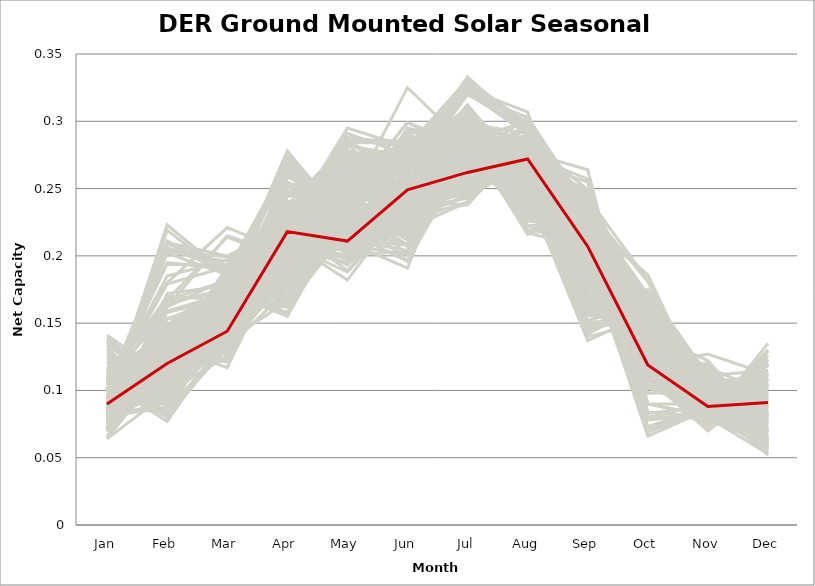
| Category | sample_001 | sample_002 | sample_003 | sample_004 | sample_005 | sample_006 | sample_007 | sample_008 | sample_009 | sample_010 | sample_011 | sample_012 | sample_013 | sample_014 | sample_015 | sample_016 | sample_017 | sample_018 | sample_019 | sample_020 | sample_021 | sample_022 | sample_023 | sample_024 | sample_025 | sample_026 | sample_027 | sample_028 | sample_029 | sample_030 | sample_031 | sample_032 | sample_033 | sample_034 | sample_035 | sample_036 | sample_037 | sample_038 | sample_039 | sample_040 | sample_041 | sample_042 | sample_043 | sample_044 | sample_045 | sample_046 | sample_047 | sample_048 | sample_049 | sample_050 | sample_051 | sample_052 | sample_053 | sample_054 | sample_055 | sample_056 | sample_057 | sample_058 | sample_059 | sample_060 | sample_061 | sample_062 | sample_063 | sample_064 | sample_065 | sample_066 | sample_067 | sample_068 | sample_069 | sample_070 | sample_071 | sample_072 | sample_073 | sample_074 | sample_075 | sample_076 | sample_077 | sample_078 | sample_079 | sample_080 | sample_081 | sample_082 | sample_083 | sample_084 | sample_085 | sample_086 | sample_087 | sample_088 | sample_089 | sample_090 | sample_091 | sample_092 | sample_093 | sample_094 | sample_095 | sample_096 | sample_097 | sample_098 | sample_099 | sample_100 | sample_101 | sample_102 | sample_103 | sample_104 | sample_105 | sample_106 | sample_107 | sample_108 | sample_109 | sample_110 | sample_111 | sample_112 | sample_113 | sample_114 | sample_115 | sample_116 | sample_117 | sample_118 | sample_119 | sample_120 | sample_121 | sample_122 | sample_123 | sample_124 | sample_125 | sample_126 | sample_127 | sample_128 | sample_129 | sample_130 | sample_131 | sample_132 | sample_133 | sample_134 | sample_135 | sample_136 | sample_137 | sample_138 | sample_139 | sample_140 | sample_141 | sample_142 | sample_143 | sample_144 | sample_145 | sample_146 | sample_147 | sample_148 | sample_149 | sample_150 | sample_151 | sample_152 | sample_153 | sample_154 | sample_155 | sample_156 | sample_157 | sample_158 | sample_159 | sample_160 | sample_161 | sample_162 | sample_163 | sample_164 | sample_165 | sample_166 | sample_167 | sample_168 | sample_169 | sample_170 | sample_171 | sample_172 | sample_173 | sample_174 | sample_175 | sample_176 | sample_178 | sample_179 | sample_180 | sample_181 | sample_182 | sample_183 | sample_184 | sample_185 | sample_186 | sample_187 | sample_188 | sample_189 | sample_190 | sample_191 | sample_192 | sample_193 | sample_194 | sample_195 | sample_196 | sample_197 | sample_198 | sample_199 | sample_200 | sample_201 | sample_202 | sample_203 | sample_204 | sample_205 | sample_206 | sample_207 | sample_208 | sample_209 | sample_210 | sample_211 | sample_212 | sample_213 | sample_214 | sample_215 | sample_216 | sample_217 | sample_218 | sample_219 | sample_220 | sample_221 | sample_222 | sample_223 | sample_224 | sample_225 | sample_226 | sample_227 | sample_228 | sample_229 | sample_230 | sample_231 | sample_232 | sample_233 | sample_234 | sample_235 | sample_236 | sample_237 | sample_238 | sample_239 | sample_240 | sample_241 | sample_242 | sample_243 | sample_244 | sample_245 | sample_246 | sample_247 | sample_248 | sample_249 | sample_250 | sample_177 |
|---|---|---|---|---|---|---|---|---|---|---|---|---|---|---|---|---|---|---|---|---|---|---|---|---|---|---|---|---|---|---|---|---|---|---|---|---|---|---|---|---|---|---|---|---|---|---|---|---|---|---|---|---|---|---|---|---|---|---|---|---|---|---|---|---|---|---|---|---|---|---|---|---|---|---|---|---|---|---|---|---|---|---|---|---|---|---|---|---|---|---|---|---|---|---|---|---|---|---|---|---|---|---|---|---|---|---|---|---|---|---|---|---|---|---|---|---|---|---|---|---|---|---|---|---|---|---|---|---|---|---|---|---|---|---|---|---|---|---|---|---|---|---|---|---|---|---|---|---|---|---|---|---|---|---|---|---|---|---|---|---|---|---|---|---|---|---|---|---|---|---|---|---|---|---|---|---|---|---|---|---|---|---|---|---|---|---|---|---|---|---|---|---|---|---|---|---|---|---|---|---|---|---|---|---|---|---|---|---|---|---|---|---|---|---|---|---|---|---|---|---|---|---|---|---|---|---|---|---|---|---|---|---|---|---|---|---|---|---|---|---|---|---|---|---|---|---|---|---|---|---|
| Jan | 0.111 | 0.075 | 0.078 | 0.105 | 0.111 | 0.086 | 0.087 | 0.134 | 0.117 | 0.109 | 0.077 | 0.083 | 0.102 | 0.08 | 0.125 | 0.086 | 0.108 | 0.113 | 0.124 | 0.076 | 0.087 | 0.087 | 0.089 | 0.106 | 0.108 | 0.099 | 0.093 | 0.118 | 0.09 | 0.075 | 0.087 | 0.083 | 0.1 | 0.087 | 0.079 | 0.082 | 0.08 | 0.09 | 0.1 | 0.141 | 0.093 | 0.122 | 0.11 | 0.081 | 0.07 | 0.093 | 0.128 | 0.139 | 0.112 | 0.093 | 0.089 | 0.086 | 0.094 | 0.116 | 0.101 | 0.137 | 0.131 | 0.077 | 0.116 | 0.077 | 0.107 | 0.1 | 0.08 | 0.07 | 0.094 | 0.08 | 0.107 | 0.089 | 0.099 | 0.117 | 0.09 | 0.087 | 0.098 | 0.11 | 0.089 | 0.072 | 0.113 | 0.112 | 0.117 | 0.086 | 0.118 | 0.112 | 0.101 | 0.136 | 0.096 | 0.122 | 0.115 | 0.107 | 0.088 | 0.09 | 0.094 | 0.085 | 0.086 | 0.086 | 0.117 | 0.072 | 0.122 | 0.113 | 0.119 | 0.082 | 0.112 | 0.066 | 0.073 | 0.083 | 0.098 | 0.093 | 0.094 | 0.081 | 0.095 | 0.134 | 0.1 | 0.121 | 0.133 | 0.137 | 0.107 | 0.093 | 0.077 | 0.094 | 0.086 | 0.08 | 0.071 | 0.086 | 0.083 | 0.07 | 0.083 | 0.085 | 0.112 | 0.085 | 0.09 | 0.088 | 0.129 | 0.108 | 0.07 | 0.11 | 0.098 | 0.064 | 0.085 | 0.081 | 0.089 | 0.093 | 0.079 | 0.104 | 0.096 | 0.131 | 0.098 | 0.09 | 0.1 | 0.088 | 0.072 | 0.102 | 0.091 | 0.081 | 0.075 | 0.1 | 0.116 | 0.064 | 0.122 | 0.122 | 0.096 | 0.081 | 0.101 | 0.138 | 0.102 | 0.112 | 0.099 | 0.09 | 0.097 | 0.087 | 0.09 | 0.117 | 0.109 | 0.082 | 0.083 | 0.087 | 0.087 | 0.113 | 0.077 | 0.086 | 0.088 | 0.087 | 0.096 | 0.078 | 0.08 | 0.102 | 0.092 | 0.09 | 0.113 | 0.095 | 0.103 | 0.114 | 0.106 | 0.072 | 0.087 | 0.1 | 0.085 | 0.092 | 0.081 | 0.106 | 0.1 | 0.095 | 0.105 | 0.098 | 0.086 | 0.088 | 0.115 | 0.085 | 0.101 | 0.111 | 0.122 | 0.108 | 0.082 | 0.108 | 0.091 | 0.093 | 0.109 | 0.089 | 0.107 | 0.099 | 0.106 | 0.079 | 0.112 | 0.101 | 0.099 | 0.108 | 0.115 | 0.081 | 0.092 | 0.11 | 0.11 | 0.065 | 0.116 | 0.11 | 0.07 | 0.09 | 0.111 | 0.097 | 0.114 | 0.094 | 0.127 | 0.137 | 0.079 | 0.086 | 0.085 | 0.115 | 0.101 | 0.117 | 0.094 | 0.08 | 0.072 | 0.09 |
| Feb | 0.124 | 0.118 | 0.164 | 0.118 | 0.122 | 0.108 | 0.125 | 0.105 | 0.088 | 0.106 | 0.135 | 0.118 | 0.115 | 0.167 | 0.106 | 0.14 | 0.08 | 0.135 | 0.109 | 0.145 | 0.108 | 0.122 | 0.148 | 0.133 | 0.13 | 0.179 | 0.112 | 0.108 | 0.144 | 0.145 | 0.109 | 0.098 | 0.124 | 0.128 | 0.118 | 0.12 | 0.134 | 0.138 | 0.167 | 0.11 | 0.126 | 0.109 | 0.116 | 0.211 | 0.159 | 0.12 | 0.101 | 0.099 | 0.134 | 0.11 | 0.124 | 0.113 | 0.093 | 0.112 | 0.195 | 0.098 | 0.093 | 0.141 | 0.101 | 0.094 | 0.158 | 0.205 | 0.133 | 0.149 | 0.086 | 0.13 | 0.089 | 0.209 | 0.21 | 0.118 | 0.125 | 0.102 | 0.122 | 0.141 | 0.11 | 0.145 | 0.131 | 0.109 | 0.09 | 0.107 | 0.119 | 0.112 | 0.12 | 0.097 | 0.09 | 0.102 | 0.119 | 0.112 | 0.108 | 0.11 | 0.109 | 0.127 | 0.133 | 0.133 | 0.111 | 0.139 | 0.113 | 0.132 | 0.126 | 0.118 | 0.096 | 0.122 | 0.153 | 0.106 | 0.112 | 0.113 | 0.129 | 0.12 | 0.14 | 0.101 | 0.094 | 0.109 | 0.109 | 0.098 | 0.123 | 0.104 | 0.102 | 0.119 | 0.104 | 0.129 | 0.149 | 0.128 | 0.219 | 0.115 | 0.131 | 0.138 | 0.128 | 0.121 | 0.131 | 0.111 | 0.104 | 0.128 | 0.113 | 0.128 | 0.12 | 0.098 | 0.126 | 0.087 | 0.112 | 0.125 | 0.121 | 0.162 | 0.126 | 0.092 | 0.119 | 0.121 | 0.126 | 0.115 | 0.172 | 0.114 | 0.145 | 0.132 | 0.167 | 0.185 | 0.122 | 0.121 | 0.12 | 0.118 | 0.125 | 0.134 | 0.203 | 0.116 | 0.12 | 0.137 | 0.096 | 0.145 | 0.097 | 0.146 | 0.124 | 0.113 | 0.138 | 0.111 | 0.104 | 0.096 | 0.103 | 0.143 | 0.149 | 0.11 | 0.117 | 0.133 | 0.104 | 0.117 | 0.121 | 0.124 | 0.117 | 0.099 | 0.124 | 0.13 | 0.083 | 0.084 | 0.077 | 0.139 | 0.084 | 0.194 | 0.137 | 0.206 | 0.136 | 0.108 | 0.112 | 0.1 | 0.17 | 0.093 | 0.111 | 0.223 | 0.123 | 0.115 | 0.135 | 0.125 | 0.097 | 0.124 | 0.123 | 0.088 | 0.111 | 0.123 | 0.18 | 0.098 | 0.158 | 0.124 | 0.084 | 0.162 | 0.143 | 0.21 | 0.133 | 0.143 | 0.119 | 0.126 | 0.115 | 0.119 | 0.089 | 0.128 | 0.114 | 0.126 | 0.154 | 0.111 | 0.082 | 0.117 | 0.121 | 0.102 | 0.108 | 0.098 | 0.125 | 0.202 | 0.108 | 0.134 | 0.123 | 0.118 | 0.119 | 0.118 | 0.144 | 0.12 |
| Mar | 0.153 | 0.189 | 0.176 | 0.16 | 0.172 | 0.147 | 0.173 | 0.131 | 0.159 | 0.143 | 0.173 | 0.174 | 0.158 | 0.182 | 0.137 | 0.178 | 0.134 | 0.168 | 0.135 | 0.166 | 0.169 | 0.174 | 0.17 | 0.117 | 0.121 | 0.192 | 0.15 | 0.156 | 0.165 | 0.179 | 0.15 | 0.156 | 0.192 | 0.157 | 0.188 | 0.175 | 0.174 | 0.163 | 0.214 | 0.155 | 0.145 | 0.153 | 0.152 | 0.186 | 0.172 | 0.17 | 0.135 | 0.147 | 0.148 | 0.174 | 0.178 | 0.174 | 0.155 | 0.172 | 0.19 | 0.148 | 0.151 | 0.161 | 0.153 | 0.141 | 0.17 | 0.199 | 0.174 | 0.15 | 0.185 | 0.151 | 0.153 | 0.189 | 0.2 | 0.174 | 0.153 | 0.181 | 0.145 | 0.151 | 0.166 | 0.172 | 0.147 | 0.147 | 0.164 | 0.147 | 0.122 | 0.16 | 0.169 | 0.135 | 0.151 | 0.154 | 0.141 | 0.166 | 0.156 | 0.146 | 0.139 | 0.178 | 0.173 | 0.175 | 0.166 | 0.153 | 0.133 | 0.147 | 0.167 | 0.172 | 0.151 | 0.133 | 0.171 | 0.144 | 0.153 | 0.153 | 0.162 | 0.185 | 0.182 | 0.15 | 0.172 | 0.134 | 0.149 | 0.14 | 0.162 | 0.161 | 0.14 | 0.145 | 0.142 | 0.152 | 0.177 | 0.173 | 0.185 | 0.189 | 0.175 | 0.176 | 0.154 | 0.17 | 0.154 | 0.162 | 0.139 | 0.142 | 0.131 | 0.127 | 0.149 | 0.126 | 0.174 | 0.131 | 0.153 | 0.168 | 0.183 | 0.215 | 0.143 | 0.138 | 0.159 | 0.164 | 0.146 | 0.159 | 0.178 | 0.173 | 0.171 | 0.171 | 0.173 | 0.197 | 0.128 | 0.134 | 0.177 | 0.153 | 0.144 | 0.142 | 0.196 | 0.155 | 0.156 | 0.17 | 0.153 | 0.167 | 0.154 | 0.171 | 0.165 | 0.138 | 0.148 | 0.171 | 0.167 | 0.15 | 0.159 | 0.15 | 0.171 | 0.169 | 0.169 | 0.173 | 0.157 | 0.182 | 0.153 | 0.172 | 0.147 | 0.157 | 0.163 | 0.146 | 0.155 | 0.131 | 0.141 | 0.162 | 0.137 | 0.193 | 0.175 | 0.189 | 0.177 | 0.173 | 0.163 | 0.15 | 0.167 | 0.147 | 0.144 | 0.186 | 0.155 | 0.157 | 0.164 | 0.123 | 0.158 | 0.161 | 0.185 | 0.155 | 0.168 | 0.142 | 0.221 | 0.151 | 0.168 | 0.178 | 0.169 | 0.183 | 0.168 | 0.193 | 0.14 | 0.17 | 0.157 | 0.151 | 0.142 | 0.177 | 0.159 | 0.136 | 0.15 | 0.147 | 0.15 | 0.148 | 0.135 | 0.147 | 0.169 | 0.151 | 0.143 | 0.138 | 0.159 | 0.186 | 0.139 | 0.153 | 0.165 | 0.134 | 0.146 | 0.183 | 0.177 | 0.144 |
| Apr | 0.238 | 0.269 | 0.237 | 0.234 | 0.216 | 0.224 | 0.162 | 0.21 | 0.187 | 0.178 | 0.225 | 0.175 | 0.233 | 0.248 | 0.212 | 0.185 | 0.187 | 0.222 | 0.206 | 0.215 | 0.255 | 0.162 | 0.188 | 0.209 | 0.208 | 0.219 | 0.192 | 0.203 | 0.185 | 0.227 | 0.253 | 0.214 | 0.202 | 0.213 | 0.263 | 0.182 | 0.179 | 0.185 | 0.197 | 0.205 | 0.19 | 0.218 | 0.238 | 0.226 | 0.245 | 0.164 | 0.209 | 0.207 | 0.186 | 0.278 | 0.165 | 0.167 | 0.217 | 0.203 | 0.225 | 0.215 | 0.212 | 0.218 | 0.211 | 0.21 | 0.232 | 0.222 | 0.17 | 0.201 | 0.201 | 0.196 | 0.174 | 0.23 | 0.222 | 0.203 | 0.22 | 0.228 | 0.188 | 0.182 | 0.276 | 0.234 | 0.178 | 0.223 | 0.198 | 0.244 | 0.211 | 0.203 | 0.228 | 0.211 | 0.217 | 0.205 | 0.179 | 0.227 | 0.213 | 0.22 | 0.193 | 0.178 | 0.184 | 0.174 | 0.214 | 0.209 | 0.197 | 0.186 | 0.223 | 0.273 | 0.175 | 0.183 | 0.226 | 0.217 | 0.188 | 0.187 | 0.163 | 0.268 | 0.202 | 0.213 | 0.186 | 0.203 | 0.21 | 0.208 | 0.225 | 0.259 | 0.212 | 0.181 | 0.224 | 0.201 | 0.224 | 0.267 | 0.224 | 0.263 | 0.183 | 0.181 | 0.221 | 0.276 | 0.216 | 0.217 | 0.208 | 0.188 | 0.191 | 0.213 | 0.192 | 0.201 | 0.167 | 0.175 | 0.229 | 0.217 | 0.261 | 0.2 | 0.194 | 0.204 | 0.234 | 0.199 | 0.208 | 0.201 | 0.251 | 0.158 | 0.186 | 0.171 | 0.254 | 0.214 | 0.204 | 0.188 | 0.246 | 0.214 | 0.207 | 0.231 | 0.215 | 0.197 | 0.234 | 0.205 | 0.222 | 0.184 | 0.225 | 0.177 | 0.181 | 0.198 | 0.185 | 0.272 | 0.26 | 0.223 | 0.231 | 0.193 | 0.24 | 0.27 | 0.271 | 0.168 | 0.264 | 0.266 | 0.202 | 0.238 | 0.191 | 0.22 | 0.219 | 0.197 | 0.22 | 0.185 | 0.191 | 0.22 | 0.166 | 0.228 | 0.17 | 0.223 | 0.186 | 0.155 | 0.224 | 0.259 | 0.233 | 0.222 | 0.22 | 0.23 | 0.218 | 0.206 | 0.225 | 0.208 | 0.189 | 0.232 | 0.267 | 0.189 | 0.252 | 0.198 | 0.203 | 0.206 | 0.229 | 0.157 | 0.19 | 0.247 | 0.211 | 0.222 | 0.19 | 0.209 | 0.211 | 0.197 | 0.22 | 0.211 | 0.193 | 0.183 | 0.182 | 0.178 | 0.212 | 0.184 | 0.189 | 0.193 | 0.209 | 0.254 | 0.215 | 0.212 | 0.205 | 0.227 | 0.224 | 0.192 | 0.162 | 0.202 | 0.197 | 0.265 | 0.225 | 0.218 |
| May | 0.226 | 0.234 | 0.243 | 0.282 | 0.193 | 0.221 | 0.22 | 0.275 | 0.21 | 0.238 | 0.261 | 0.217 | 0.276 | 0.24 | 0.27 | 0.219 | 0.248 | 0.295 | 0.261 | 0.252 | 0.229 | 0.227 | 0.222 | 0.257 | 0.251 | 0.214 | 0.231 | 0.201 | 0.221 | 0.255 | 0.255 | 0.262 | 0.245 | 0.262 | 0.236 | 0.222 | 0.225 | 0.228 | 0.2 | 0.276 | 0.228 | 0.207 | 0.283 | 0.218 | 0.248 | 0.229 | 0.264 | 0.285 | 0.236 | 0.224 | 0.225 | 0.229 | 0.259 | 0.201 | 0.202 | 0.278 | 0.283 | 0.27 | 0.212 | 0.254 | 0.261 | 0.208 | 0.224 | 0.278 | 0.225 | 0.251 | 0.224 | 0.21 | 0.213 | 0.199 | 0.273 | 0.207 | 0.228 | 0.249 | 0.224 | 0.258 | 0.233 | 0.205 | 0.218 | 0.253 | 0.252 | 0.218 | 0.278 | 0.275 | 0.26 | 0.212 | 0.235 | 0.291 | 0.257 | 0.26 | 0.222 | 0.219 | 0.222 | 0.222 | 0.197 | 0.27 | 0.26 | 0.26 | 0.189 | 0.222 | 0.233 | 0.239 | 0.253 | 0.264 | 0.222 | 0.221 | 0.237 | 0.24 | 0.249 | 0.279 | 0.232 | 0.271 | 0.273 | 0.286 | 0.287 | 0.236 | 0.25 | 0.225 | 0.263 | 0.251 | 0.256 | 0.232 | 0.207 | 0.236 | 0.226 | 0.22 | 0.207 | 0.227 | 0.273 | 0.269 | 0.262 | 0.24 | 0.238 | 0.253 | 0.229 | 0.229 | 0.222 | 0.234 | 0.254 | 0.271 | 0.237 | 0.2 | 0.225 | 0.271 | 0.27 | 0.256 | 0.224 | 0.261 | 0.235 | 0.238 | 0.226 | 0.215 | 0.242 | 0.216 | 0.258 | 0.241 | 0.239 | 0.209 | 0.223 | 0.228 | 0.211 | 0.278 | 0.267 | 0.195 | 0.267 | 0.227 | 0.263 | 0.229 | 0.232 | 0.261 | 0.248 | 0.227 | 0.234 | 0.261 | 0.24 | 0.259 | 0.244 | 0.228 | 0.225 | 0.228 | 0.235 | 0.239 | 0.257 | 0.251 | 0.216 | 0.264 | 0.288 | 0.226 | 0.251 | 0.25 | 0.24 | 0.26 | 0.229 | 0.21 | 0.22 | 0.208 | 0.218 | 0.235 | 0.239 | 0.236 | 0.254 | 0.263 | 0.224 | 0.204 | 0.203 | 0.258 | 0.284 | 0.255 | 0.208 | 0.286 | 0.232 | 0.24 | 0.23 | 0.222 | 0.208 | 0.258 | 0.258 | 0.234 | 0.234 | 0.236 | 0.182 | 0.209 | 0.222 | 0.188 | 0.204 | 0.247 | 0.213 | 0.2 | 0.232 | 0.239 | 0.24 | 0.236 | 0.274 | 0.217 | 0.241 | 0.227 | 0.194 | 0.241 | 0.276 | 0.276 | 0.256 | 0.209 | 0.261 | 0.266 | 0.235 | 0.259 | 0.218 | 0.237 | 0.255 | 0.211 |
| Jun | 0.255 | 0.275 | 0.288 | 0.274 | 0.235 | 0.238 | 0.23 | 0.253 | 0.191 | 0.269 | 0.261 | 0.223 | 0.278 | 0.287 | 0.241 | 0.233 | 0.233 | 0.281 | 0.25 | 0.27 | 0.281 | 0.22 | 0.248 | 0.252 | 0.256 | 0.223 | 0.244 | 0.203 | 0.241 | 0.282 | 0.253 | 0.217 | 0.253 | 0.28 | 0.272 | 0.226 | 0.238 | 0.243 | 0.236 | 0.273 | 0.24 | 0.22 | 0.271 | 0.249 | 0.29 | 0.226 | 0.245 | 0.256 | 0.281 | 0.284 | 0.215 | 0.23 | 0.23 | 0.23 | 0.229 | 0.258 | 0.242 | 0.239 | 0.208 | 0.217 | 0.263 | 0.242 | 0.243 | 0.225 | 0.248 | 0.279 | 0.258 | 0.25 | 0.234 | 0.232 | 0.28 | 0.265 | 0.24 | 0.269 | 0.283 | 0.277 | 0.271 | 0.22 | 0.196 | 0.253 | 0.258 | 0.209 | 0.268 | 0.25 | 0.229 | 0.204 | 0.273 | 0.275 | 0.267 | 0.224 | 0.228 | 0.225 | 0.23 | 0.24 | 0.235 | 0.23 | 0.254 | 0.273 | 0.238 | 0.288 | 0.269 | 0.276 | 0.285 | 0.214 | 0.226 | 0.24 | 0.208 | 0.276 | 0.246 | 0.24 | 0.224 | 0.252 | 0.261 | 0.257 | 0.285 | 0.282 | 0.224 | 0.24 | 0.218 | 0.279 | 0.286 | 0.282 | 0.241 | 0.277 | 0.237 | 0.236 | 0.233 | 0.295 | 0.28 | 0.267 | 0.24 | 0.278 | 0.271 | 0.248 | 0.245 | 0.278 | 0.229 | 0.286 | 0.257 | 0.252 | 0.274 | 0.23 | 0.233 | 0.235 | 0.279 | 0.272 | 0.234 | 0.274 | 0.283 | 0.201 | 0.237 | 0.229 | 0.299 | 0.225 | 0.251 | 0.276 | 0.325 | 0.225 | 0.24 | 0.257 | 0.235 | 0.268 | 0.278 | 0.241 | 0.228 | 0.247 | 0.223 | 0.237 | 0.227 | 0.244 | 0.278 | 0.291 | 0.276 | 0.222 | 0.258 | 0.278 | 0.299 | 0.275 | 0.293 | 0.245 | 0.267 | 0.276 | 0.278 | 0.265 | 0.232 | 0.223 | 0.281 | 0.243 | 0.242 | 0.24 | 0.234 | 0.26 | 0.271 | 0.233 | 0.24 | 0.246 | 0.237 | 0.196 | 0.28 | 0.275 | 0.251 | 0.221 | 0.247 | 0.263 | 0.223 | 0.273 | 0.284 | 0.236 | 0.201 | 0.282 | 0.282 | 0.229 | 0.283 | 0.233 | 0.23 | 0.218 | 0.252 | 0.207 | 0.233 | 0.279 | 0.241 | 0.233 | 0.232 | 0.236 | 0.241 | 0.28 | 0.249 | 0.242 | 0.229 | 0.266 | 0.272 | 0.272 | 0.244 | 0.234 | 0.223 | 0.23 | 0.227 | 0.261 | 0.253 | 0.248 | 0.28 | 0.244 | 0.22 | 0.275 | 0.212 | 0.265 | 0.22 | 0.266 | 0.271 | 0.249 |
| Jul | 0.272 | 0.281 | 0.279 | 0.286 | 0.28 | 0.249 | 0.285 | 0.285 | 0.3 | 0.322 | 0.283 | 0.276 | 0.298 | 0.291 | 0.271 | 0.3 | 0.288 | 0.288 | 0.283 | 0.291 | 0.289 | 0.287 | 0.301 | 0.274 | 0.276 | 0.273 | 0.244 | 0.285 | 0.292 | 0.279 | 0.289 | 0.27 | 0.273 | 0.309 | 0.29 | 0.277 | 0.295 | 0.297 | 0.261 | 0.275 | 0.246 | 0.285 | 0.29 | 0.311 | 0.274 | 0.292 | 0.277 | 0.284 | 0.331 | 0.292 | 0.283 | 0.286 | 0.277 | 0.271 | 0.301 | 0.274 | 0.276 | 0.29 | 0.292 | 0.257 | 0.27 | 0.297 | 0.282 | 0.298 | 0.286 | 0.3 | 0.32 | 0.312 | 0.299 | 0.275 | 0.303 | 0.29 | 0.254 | 0.32 | 0.283 | 0.281 | 0.333 | 0.27 | 0.298 | 0.286 | 0.269 | 0.294 | 0.279 | 0.279 | 0.278 | 0.293 | 0.324 | 0.286 | 0.3 | 0.273 | 0.244 | 0.282 | 0.291 | 0.294 | 0.268 | 0.292 | 0.28 | 0.324 | 0.289 | 0.289 | 0.322 | 0.293 | 0.289 | 0.264 | 0.24 | 0.238 | 0.282 | 0.289 | 0.283 | 0.272 | 0.307 | 0.278 | 0.275 | 0.285 | 0.289 | 0.289 | 0.257 | 0.245 | 0.27 | 0.307 | 0.284 | 0.294 | 0.308 | 0.287 | 0.281 | 0.303 | 0.281 | 0.284 | 0.306 | 0.299 | 0.273 | 0.33 | 0.282 | 0.282 | 0.245 | 0.286 | 0.283 | 0.278 | 0.28 | 0.296 | 0.293 | 0.262 | 0.248 | 0.274 | 0.297 | 0.271 | 0.254 | 0.302 | 0.281 | 0.273 | 0.302 | 0.288 | 0.277 | 0.27 | 0.272 | 0.285 | 0.282 | 0.284 | 0.254 | 0.245 | 0.299 | 0.266 | 0.298 | 0.283 | 0.289 | 0.301 | 0.279 | 0.306 | 0.301 | 0.272 | 0.327 | 0.294 | 0.285 | 0.273 | 0.27 | 0.323 | 0.282 | 0.28 | 0.29 | 0.29 | 0.285 | 0.288 | 0.296 | 0.29 | 0.248 | 0.279 | 0.288 | 0.251 | 0.279 | 0.278 | 0.29 | 0.3 | 0.283 | 0.305 | 0.293 | 0.302 | 0.3 | 0.274 | 0.289 | 0.296 | 0.263 | 0.28 | 0.255 | 0.312 | 0.28 | 0.305 | 0.292 | 0.266 | 0.298 | 0.298 | 0.297 | 0.309 | 0.289 | 0.252 | 0.259 | 0.276 | 0.271 | 0.286 | 0.303 | 0.293 | 0.295 | 0.296 | 0.255 | 0.286 | 0.279 | 0.297 | 0.25 | 0.281 | 0.305 | 0.277 | 0.322 | 0.329 | 0.303 | 0.243 | 0.285 | 0.238 | 0.279 | 0.292 | 0.285 | 0.286 | 0.303 | 0.31 | 0.273 | 0.324 | 0.273 | 0.278 | 0.24 | 0.286 | 0.278 | 0.262 |
| Aug | 0.273 | 0.242 | 0.284 | 0.219 | 0.232 | 0.27 | 0.253 | 0.258 | 0.247 | 0.292 | 0.28 | 0.253 | 0.227 | 0.279 | 0.259 | 0.247 | 0.27 | 0.216 | 0.26 | 0.283 | 0.252 | 0.262 | 0.242 | 0.254 | 0.258 | 0.297 | 0.284 | 0.236 | 0.24 | 0.284 | 0.268 | 0.269 | 0.252 | 0.25 | 0.245 | 0.256 | 0.254 | 0.24 | 0.299 | 0.242 | 0.288 | 0.24 | 0.217 | 0.261 | 0.286 | 0.258 | 0.257 | 0.246 | 0.298 | 0.24 | 0.263 | 0.26 | 0.273 | 0.234 | 0.269 | 0.241 | 0.245 | 0.282 | 0.246 | 0.275 | 0.267 | 0.277 | 0.25 | 0.291 | 0.272 | 0.256 | 0.303 | 0.26 | 0.275 | 0.239 | 0.241 | 0.254 | 0.287 | 0.294 | 0.244 | 0.279 | 0.293 | 0.236 | 0.249 | 0.273 | 0.252 | 0.25 | 0.223 | 0.256 | 0.277 | 0.239 | 0.291 | 0.218 | 0.248 | 0.275 | 0.269 | 0.254 | 0.251 | 0.251 | 0.235 | 0.283 | 0.254 | 0.297 | 0.23 | 0.246 | 0.299 | 0.283 | 0.283 | 0.274 | 0.283 | 0.287 | 0.275 | 0.236 | 0.257 | 0.239 | 0.249 | 0.264 | 0.241 | 0.254 | 0.226 | 0.258 | 0.277 | 0.287 | 0.269 | 0.256 | 0.283 | 0.244 | 0.254 | 0.247 | 0.249 | 0.25 | 0.241 | 0.256 | 0.242 | 0.242 | 0.257 | 0.292 | 0.27 | 0.253 | 0.287 | 0.3 | 0.257 | 0.287 | 0.279 | 0.232 | 0.239 | 0.297 | 0.284 | 0.253 | 0.233 | 0.303 | 0.269 | 0.251 | 0.274 | 0.271 | 0.248 | 0.259 | 0.281 | 0.297 | 0.253 | 0.284 | 0.288 | 0.237 | 0.276 | 0.28 | 0.282 | 0.239 | 0.229 | 0.235 | 0.277 | 0.24 | 0.28 | 0.247 | 0.247 | 0.256 | 0.299 | 0.247 | 0.252 | 0.271 | 0.283 | 0.298 | 0.283 | 0.248 | 0.252 | 0.254 | 0.251 | 0.244 | 0.253 | 0.273 | 0.27 | 0.279 | 0.222 | 0.283 | 0.277 | 0.279 | 0.265 | 0.283 | 0.282 | 0.269 | 0.253 | 0.258 | 0.246 | 0.27 | 0.286 | 0.258 | 0.257 | 0.279 | 0.27 | 0.259 | 0.239 | 0.254 | 0.227 | 0.248 | 0.243 | 0.228 | 0.244 | 0.255 | 0.254 | 0.282 | 0.296 | 0.277 | 0.269 | 0.262 | 0.25 | 0.277 | 0.237 | 0.276 | 0.28 | 0.238 | 0.239 | 0.252 | 0.278 | 0.245 | 0.25 | 0.29 | 0.29 | 0.294 | 0.283 | 0.278 | 0.275 | 0.288 | 0.233 | 0.266 | 0.255 | 0.249 | 0.247 | 0.259 | 0.276 | 0.307 | 0.273 | 0.249 | 0.28 | 0.238 | 0.282 | 0.272 |
| Sep | 0.191 | 0.186 | 0.219 | 0.222 | 0.21 | 0.187 | 0.144 | 0.191 | 0.234 | 0.24 | 0.244 | 0.146 | 0.215 | 0.211 | 0.201 | 0.137 | 0.203 | 0.23 | 0.195 | 0.226 | 0.195 | 0.159 | 0.151 | 0.219 | 0.227 | 0.227 | 0.208 | 0.234 | 0.156 | 0.236 | 0.195 | 0.249 | 0.215 | 0.228 | 0.189 | 0.147 | 0.142 | 0.151 | 0.225 | 0.174 | 0.201 | 0.231 | 0.206 | 0.193 | 0.226 | 0.159 | 0.197 | 0.179 | 0.211 | 0.174 | 0.161 | 0.152 | 0.205 | 0.218 | 0.204 | 0.178 | 0.179 | 0.235 | 0.231 | 0.257 | 0.186 | 0.215 | 0.16 | 0.223 | 0.163 | 0.228 | 0.23 | 0.208 | 0.213 | 0.218 | 0.227 | 0.181 | 0.207 | 0.192 | 0.17 | 0.233 | 0.219 | 0.236 | 0.234 | 0.196 | 0.219 | 0.237 | 0.22 | 0.19 | 0.2 | 0.225 | 0.221 | 0.218 | 0.23 | 0.227 | 0.225 | 0.156 | 0.146 | 0.161 | 0.23 | 0.235 | 0.21 | 0.2 | 0.198 | 0.178 | 0.234 | 0.222 | 0.236 | 0.247 | 0.219 | 0.221 | 0.165 | 0.19 | 0.21 | 0.179 | 0.192 | 0.205 | 0.182 | 0.184 | 0.219 | 0.187 | 0.264 | 0.215 | 0.255 | 0.229 | 0.234 | 0.19 | 0.198 | 0.187 | 0.161 | 0.144 | 0.242 | 0.182 | 0.227 | 0.229 | 0.199 | 0.223 | 0.227 | 0.216 | 0.211 | 0.228 | 0.159 | 0.249 | 0.184 | 0.217 | 0.186 | 0.222 | 0.21 | 0.184 | 0.221 | 0.235 | 0.205 | 0.227 | 0.213 | 0.163 | 0.149 | 0.156 | 0.227 | 0.229 | 0.213 | 0.226 | 0.19 | 0.24 | 0.207 | 0.172 | 0.208 | 0.167 | 0.23 | 0.217 | 0.215 | 0.159 | 0.219 | 0.146 | 0.14 | 0.205 | 0.199 | 0.181 | 0.191 | 0.212 | 0.189 | 0.188 | 0.222 | 0.181 | 0.173 | 0.156 | 0.192 | 0.193 | 0.221 | 0.216 | 0.233 | 0.211 | 0.211 | 0.207 | 0.195 | 0.21 | 0.198 | 0.235 | 0.245 | 0.21 | 0.159 | 0.209 | 0.144 | 0.161 | 0.204 | 0.198 | 0.183 | 0.209 | 0.192 | 0.187 | 0.236 | 0.234 | 0.228 | 0.215 | 0.235 | 0.214 | 0.186 | 0.192 | 0.191 | 0.215 | 0.213 | 0.246 | 0.183 | 0.159 | 0.188 | 0.205 | 0.205 | 0.215 | 0.208 | 0.213 | 0.237 | 0.235 | 0.206 | 0.224 | 0.195 | 0.214 | 0.236 | 0.222 | 0.243 | 0.219 | 0.206 | 0.2 | 0.207 | 0.198 | 0.187 | 0.185 | 0.227 | 0.201 | 0.239 | 0.182 | 0.159 | 0.217 | 0.199 | 0.186 | 0.228 | 0.207 |
| Oct | 0.128 | 0.11 | 0.148 | 0.116 | 0.137 | 0.114 | 0.173 | 0.127 | 0.145 | 0.129 | 0.152 | 0.158 | 0.126 | 0.138 | 0.118 | 0.158 | 0.129 | 0.102 | 0.123 | 0.168 | 0.128 | 0.162 | 0.151 | 0.126 | 0.121 | 0.124 | 0.128 | 0.154 | 0.148 | 0.158 | 0.13 | 0.083 | 0.134 | 0.148 | 0.114 | 0.151 | 0.165 | 0.146 | 0.136 | 0.133 | 0.125 | 0.145 | 0.125 | 0.104 | 0.145 | 0.164 | 0.117 | 0.138 | 0.125 | 0.12 | 0.161 | 0.164 | 0.072 | 0.137 | 0.112 | 0.131 | 0.122 | 0.171 | 0.148 | 0.09 | 0.109 | 0.127 | 0.16 | 0.186 | 0.124 | 0.163 | 0.143 | 0.109 | 0.121 | 0.131 | 0.131 | 0.111 | 0.124 | 0.127 | 0.133 | 0.154 | 0.117 | 0.139 | 0.14 | 0.134 | 0.12 | 0.15 | 0.107 | 0.132 | 0.066 | 0.152 | 0.117 | 0.109 | 0.142 | 0.08 | 0.125 | 0.159 | 0.158 | 0.158 | 0.132 | 0.181 | 0.125 | 0.129 | 0.135 | 0.129 | 0.14 | 0.165 | 0.158 | 0.084 | 0.118 | 0.125 | 0.171 | 0.114 | 0.13 | 0.126 | 0.134 | 0.122 | 0.133 | 0.135 | 0.114 | 0.136 | 0.09 | 0.125 | 0.08 | 0.158 | 0.158 | 0.121 | 0.104 | 0.108 | 0.145 | 0.163 | 0.14 | 0.137 | 0.136 | 0.128 | 0.118 | 0.117 | 0.16 | 0.118 | 0.126 | 0.149 | 0.166 | 0.146 | 0.145 | 0.127 | 0.123 | 0.137 | 0.125 | 0.126 | 0.133 | 0.142 | 0.108 | 0.149 | 0.127 | 0.166 | 0.157 | 0.165 | 0.146 | 0.122 | 0.121 | 0.157 | 0.143 | 0.154 | 0.113 | 0.127 | 0.127 | 0.134 | 0.13 | 0.149 | 0.072 | 0.153 | 0.071 | 0.158 | 0.151 | 0.113 | 0.127 | 0.132 | 0.128 | 0.073 | 0.143 | 0.136 | 0.145 | 0.128 | 0.134 | 0.156 | 0.132 | 0.116 | 0.155 | 0.119 | 0.132 | 0.078 | 0.117 | 0.123 | 0.071 | 0.133 | 0.124 | 0.17 | 0.162 | 0.117 | 0.154 | 0.098 | 0.164 | 0.166 | 0.145 | 0.139 | 0.109 | 0.069 | 0.117 | 0.11 | 0.155 | 0.147 | 0.117 | 0.123 | 0.153 | 0.125 | 0.12 | 0.124 | 0.134 | 0.115 | 0.131 | 0.09 | 0.109 | 0.156 | 0.137 | 0.12 | 0.146 | 0.135 | 0.122 | 0.145 | 0.133 | 0.163 | 0.117 | 0.132 | 0.129 | 0.158 | 0.112 | 0.117 | 0.182 | 0.124 | 0.134 | 0.122 | 0.132 | 0.13 | 0.129 | 0.134 | 0.152 | 0.107 | 0.081 | 0.143 | 0.175 | 0.129 | 0.116 | 0.11 | 0.152 | 0.119 |
| Nov | 0.105 | 0.073 | 0.085 | 0.079 | 0.09 | 0.084 | 0.103 | 0.103 | 0.097 | 0.116 | 0.085 | 0.104 | 0.078 | 0.089 | 0.108 | 0.097 | 0.104 | 0.086 | 0.112 | 0.082 | 0.096 | 0.105 | 0.096 | 0.114 | 0.119 | 0.091 | 0.103 | 0.086 | 0.099 | 0.081 | 0.094 | 0.088 | 0.084 | 0.08 | 0.081 | 0.1 | 0.1 | 0.101 | 0.1 | 0.088 | 0.102 | 0.082 | 0.08 | 0.088 | 0.082 | 0.109 | 0.11 | 0.098 | 0.102 | 0.088 | 0.107 | 0.103 | 0.085 | 0.089 | 0.097 | 0.089 | 0.095 | 0.086 | 0.083 | 0.081 | 0.074 | 0.091 | 0.1 | 0.091 | 0.105 | 0.08 | 0.122 | 0.09 | 0.088 | 0.084 | 0.084 | 0.111 | 0.102 | 0.091 | 0.086 | 0.081 | 0.102 | 0.083 | 0.099 | 0.095 | 0.113 | 0.094 | 0.088 | 0.107 | 0.086 | 0.088 | 0.105 | 0.083 | 0.081 | 0.09 | 0.11 | 0.101 | 0.092 | 0.104 | 0.089 | 0.089 | 0.118 | 0.091 | 0.088 | 0.088 | 0.117 | 0.099 | 0.092 | 0.08 | 0.107 | 0.107 | 0.112 | 0.081 | 0.082 | 0.095 | 0.096 | 0.108 | 0.091 | 0.099 | 0.086 | 0.09 | 0.081 | 0.113 | 0.08 | 0.082 | 0.08 | 0.087 | 0.089 | 0.076 | 0.101 | 0.096 | 0.078 | 0.086 | 0.084 | 0.085 | 0.108 | 0.106 | 0.103 | 0.12 | 0.101 | 0.112 | 0.104 | 0.111 | 0.106 | 0.078 | 0.08 | 0.098 | 0.1 | 0.102 | 0.079 | 0.117 | 0.096 | 0.086 | 0.088 | 0.108 | 0.099 | 0.101 | 0.084 | 0.089 | 0.108 | 0.099 | 0.096 | 0.082 | 0.096 | 0.086 | 0.091 | 0.093 | 0.081 | 0.081 | 0.089 | 0.096 | 0.087 | 0.096 | 0.099 | 0.11 | 0.101 | 0.091 | 0.096 | 0.088 | 0.105 | 0.079 | 0.084 | 0.093 | 0.083 | 0.104 | 0.092 | 0.079 | 0.082 | 0.127 | 0.112 | 0.083 | 0.085 | 0.099 | 0.091 | 0.097 | 0.106 | 0.092 | 0.105 | 0.09 | 0.1 | 0.099 | 0.098 | 0.11 | 0.111 | 0.09 | 0.07 | 0.087 | 0.085 | 0.088 | 0.078 | 0.084 | 0.085 | 0.119 | 0.101 | 0.081 | 0.085 | 0.108 | 0.101 | 0.1 | 0.088 | 0.09 | 0.077 | 0.108 | 0.104 | 0.089 | 0.093 | 0.085 | 0.101 | 0.08 | 0.087 | 0.086 | 0.096 | 0.087 | 0.104 | 0.105 | 0.11 | 0.106 | 0.088 | 0.107 | 0.099 | 0.097 | 0.091 | 0.099 | 0.105 | 0.099 | 0.083 | 0.09 | 0.079 | 0.079 | 0.111 | 0.115 | 0.101 | 0.08 | 0.078 | 0.088 |
| Dec | 0.089 | 0.109 | 0.084 | 0.119 | 0.055 | 0.088 | 0.09 | 0.061 | 0.069 | 0.07 | 0.088 | 0.095 | 0.129 | 0.081 | 0.057 | 0.109 | 0.108 | 0.119 | 0.056 | 0.085 | 0.08 | 0.091 | 0.105 | 0.059 | 0.065 | 0.1 | 0.088 | 0.066 | 0.103 | 0.089 | 0.078 | 0.063 | 0.084 | 0.123 | 0.104 | 0.092 | 0.108 | 0.106 | 0.105 | 0.066 | 0.083 | 0.068 | 0.121 | 0.102 | 0.08 | 0.087 | 0.057 | 0.065 | 0.08 | 0.082 | 0.095 | 0.089 | 0.093 | 0.062 | 0.098 | 0.063 | 0.064 | 0.084 | 0.064 | 0.069 | 0.109 | 0.105 | 0.106 | 0.084 | 0.092 | 0.104 | 0.07 | 0.098 | 0.104 | 0.065 | 0.13 | 0.092 | 0.081 | 0.081 | 0.081 | 0.089 | 0.074 | 0.07 | 0.072 | 0.078 | 0.061 | 0.07 | 0.114 | 0.06 | 0.085 | 0.065 | 0.076 | 0.114 | 0.129 | 0.067 | 0.093 | 0.102 | 0.113 | 0.105 | 0.06 | 0.083 | 0.06 | 0.081 | 0.053 | 0.084 | 0.071 | 0.082 | 0.087 | 0.065 | 0.09 | 0.088 | 0.088 | 0.104 | 0.094 | 0.063 | 0.099 | 0.062 | 0.063 | 0.065 | 0.113 | 0.09 | 0.069 | 0.086 | 0.062 | 0.112 | 0.092 | 0.088 | 0.099 | 0.108 | 0.108 | 0.103 | 0.061 | 0.089 | 0.13 | 0.123 | 0.059 | 0.077 | 0.078 | 0.069 | 0.085 | 0.09 | 0.09 | 0.101 | 0.081 | 0.135 | 0.102 | 0.108 | 0.081 | 0.059 | 0.126 | 0.098 | 0.083 | 0.119 | 0.08 | 0.094 | 0.102 | 0.094 | 0.081 | 0.103 | 0.062 | 0.078 | 0.078 | 0.06 | 0.085 | 0.079 | 0.098 | 0.069 | 0.123 | 0.058 | 0.084 | 0.1 | 0.083 | 0.104 | 0.101 | 0.06 | 0.075 | 0.083 | 0.08 | 0.076 | 0.074 | 0.085 | 0.079 | 0.08 | 0.082 | 0.107 | 0.081 | 0.099 | 0.109 | 0.112 | 0.094 | 0.079 | 0.114 | 0.083 | 0.078 | 0.107 | 0.111 | 0.078 | 0.108 | 0.1 | 0.102 | 0.1 | 0.106 | 0.095 | 0.115 | 0.085 | 0.105 | 0.084 | 0.088 | 0.095 | 0.062 | 0.123 | 0.112 | 0.062 | 0.076 | 0.12 | 0.098 | 0.104 | 0.079 | 0.082 | 0.114 | 0.062 | 0.111 | 0.095 | 0.097 | 0.072 | 0.052 | 0.098 | 0.083 | 0.053 | 0.062 | 0.108 | 0.089 | 0.065 | 0.098 | 0.081 | 0.081 | 0.075 | 0.079 | 0.09 | 0.103 | 0.086 | 0.054 | 0.078 | 0.065 | 0.06 | 0.119 | 0.097 | 0.066 | 0.084 | 0.092 | 0.059 | 0.074 | 0.102 | 0.09 | 0.091 |